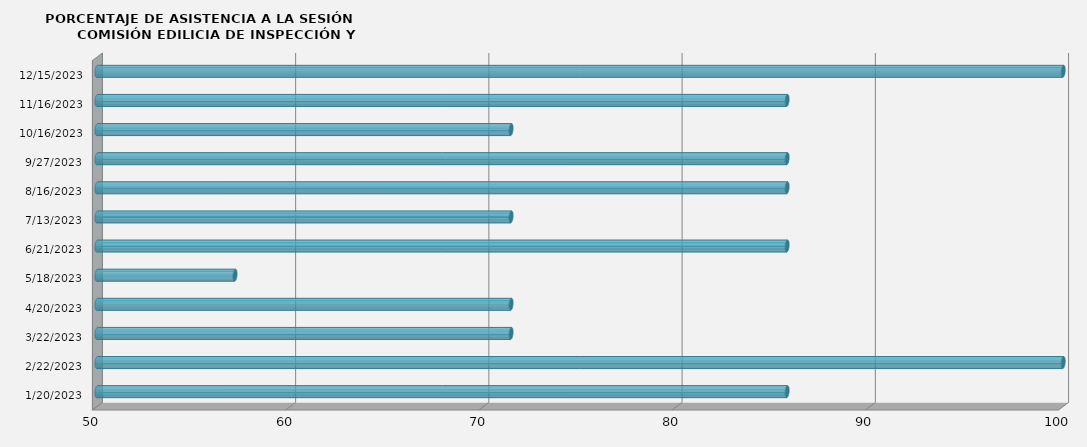
| Category | Series 0 |
|---|---|
| 1/20/23 | 85.714 |
| 2/22/23 | 100 |
| 3/22/23 | 71.429 |
| 4/20/23 | 71.429 |
| 5/18/23 | 57.143 |
| 6/21/23 | 85.714 |
| 7/13/23 | 71.429 |
| 8/16/23 | 85.714 |
| 9/27/23 | 85.714 |
| 10/16/23 | 71.429 |
| 11/16/23 | 85.714 |
| 12/15/23 | 100 |